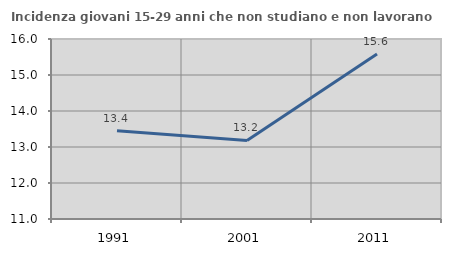
| Category | Incidenza giovani 15-29 anni che non studiano e non lavorano  |
|---|---|
| 1991.0 | 13.45 |
| 2001.0 | 13.182 |
| 2011.0 | 15.581 |